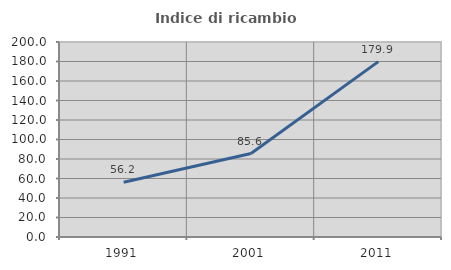
| Category | Indice di ricambio occupazionale  |
|---|---|
| 1991.0 | 56.213 |
| 2001.0 | 85.625 |
| 2011.0 | 179.859 |